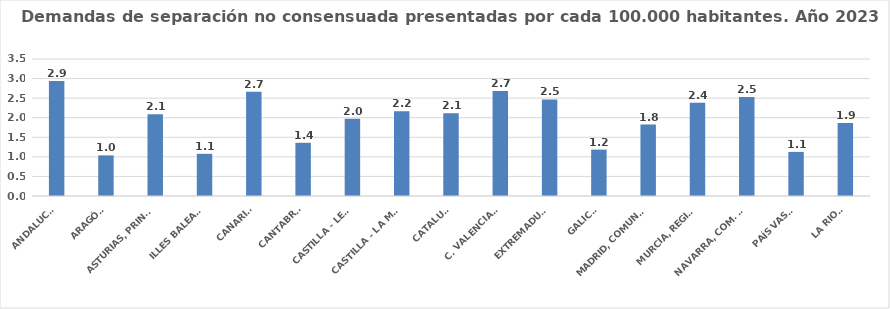
| Category | Series 0 |
|---|---|
| ANDALUCÍA | 2.939 |
| ARAGÓN | 1.038 |
| ASTURIAS, PRINCIPADO | 2.086 |
| ILLES BALEARS | 1.077 |
| CANARIAS | 2.666 |
| CANTABRIA | 1.359 |
| CASTILLA - LEÓN | 1.973 |
| CASTILLA - LA MANCHA | 2.163 |
| CATALUÑA | 2.114 |
| C. VALENCIANA | 2.683 |
| EXTREMADURA | 2.466 |
| GALICIA | 1.185 |
| MADRID, COMUNIDAD | 1.825 |
| MURCIA, REGIÓN | 2.383 |
| NAVARRA, COM. FORAL | 2.529 |
| PAÍS VASCO | 1.126 |
| LA RIOJA | 1.862 |